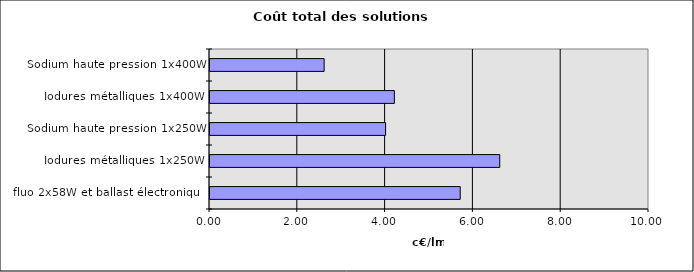
| Category | Series 0 |
|---|---|
| fluo 2x58W et ballast électronique | 5.7 |
| Iodures métalliques 1x250W | 6.6 |
| Sodium haute pression 1x250W | 4 |
| Iodures métalliques 1x400W | 4.2 |
| Sodium haute pression 1x400W | 2.6 |